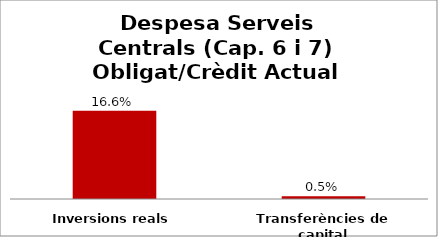
| Category | Series 0 |
|---|---|
| Inversions reals | 0.166 |
| Transferències de capital | 0.005 |